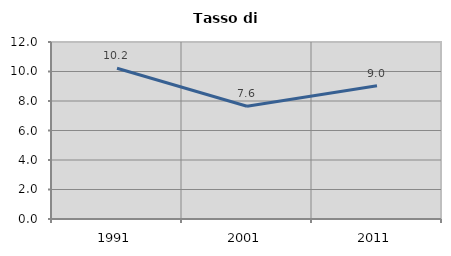
| Category | Tasso di disoccupazione   |
|---|---|
| 1991.0 | 10.218 |
| 2001.0 | 7.642 |
| 2011.0 | 9.032 |